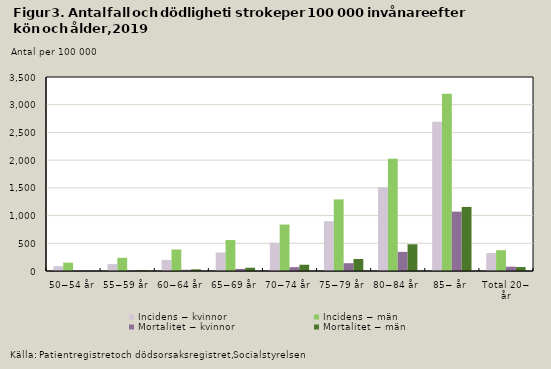
| Category | Incidens − kvinnor | Incidens − män | Mortalitet − kvinnor | Mortalitet − män |
|---|---|---|---|---|
| 50−54 år | 87 | 151 | 5 | 8 |
| 55−59 år | 125 | 238 | 11 | 18 |
| 60−64 år | 200 | 388 | 22 | 30 |
| 65−69 år | 334 | 558 | 37 | 59 |
| 70−74 år | 509 | 838 | 70 | 113 |
| 75−79 år | 898 | 1292 | 141 | 216 |
| 80−84 år | 1511 | 2023 | 345 | 482 |
| 85− år | 2693 | 3200 | 1071 | 1156 |
| Total 20− år | 324 | 375 | 78 | 71 |